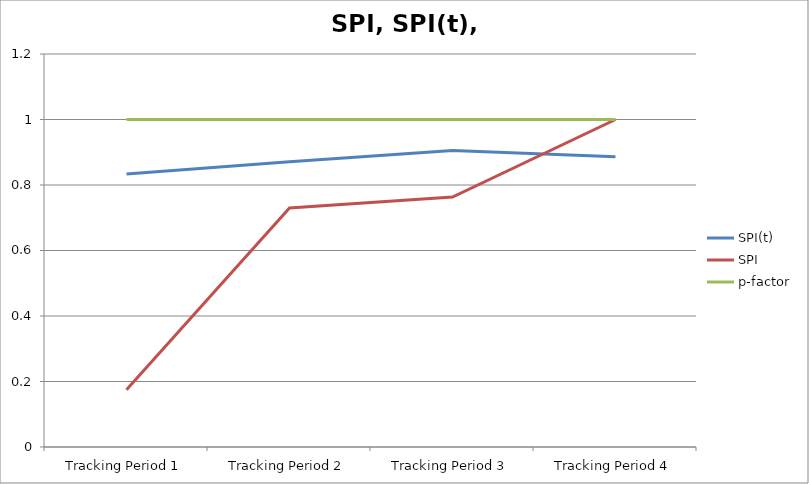
| Category | SPI(t) | SPI | p-factor |
|---|---|---|---|
| Tracking Period 1 | 0.833 | 0.175 | 1 |
| Tracking Period 2 | 0.871 | 0.73 | 1 |
| Tracking Period 3 | 0.905 | 0.763 | 1 |
| Tracking Period 4 | 0.886 | 1 | 1 |